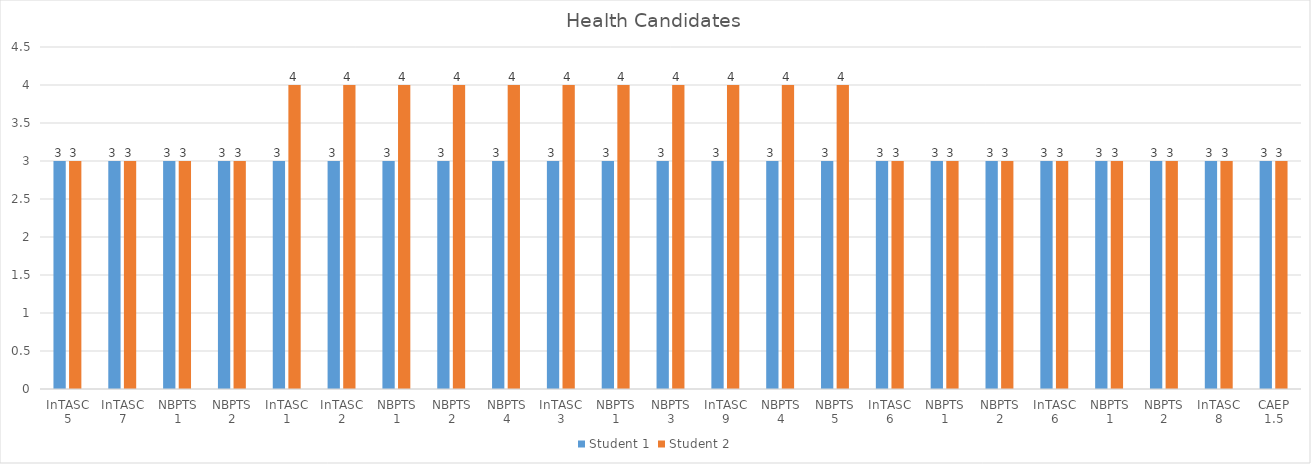
| Category | Student 1 | Student 2 |
|---|---|---|
| InTASC 5 | 3 | 3 |
| InTASC 7 | 3 | 3 |
| NBPTS 1 | 3 | 3 |
| NBPTS 2 | 3 | 3 |
| InTASC 1 | 3 | 4 |
| InTASC 2 | 3 | 4 |
| NBPTS 1 | 3 | 4 |
| NBPTS 2 | 3 | 4 |
| NBPTS 4 | 3 | 4 |
| InTASC 3 | 3 | 4 |
| NBPTS 1 | 3 | 4 |
| NBPTS 3 | 3 | 4 |
| InTASC 9 | 3 | 4 |
| NBPTS 4 | 3 | 4 |
| NBPTS 5 | 3 | 4 |
| InTASC 6 | 3 | 3 |
| NBPTS 1 | 3 | 3 |
| NBPTS 2 | 3 | 3 |
| InTASC 6 | 3 | 3 |
| NBPTS 1 | 3 | 3 |
| NBPTS 2 | 3 | 3 |
| InTASC 8 | 3 | 3 |
| CAEP 1.5 | 3 | 3 |